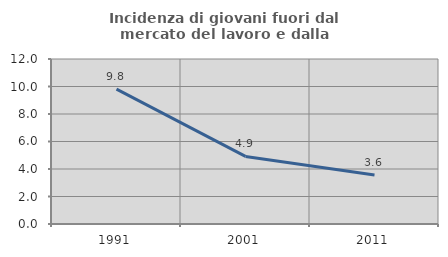
| Category | Incidenza di giovani fuori dal mercato del lavoro e dalla formazione  |
|---|---|
| 1991.0 | 9.811 |
| 2001.0 | 4.915 |
| 2011.0 | 3.571 |